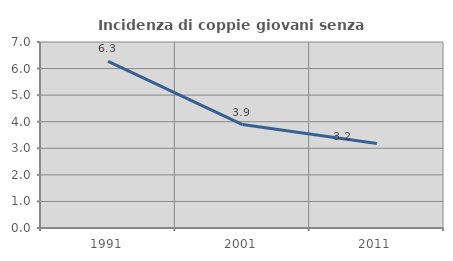
| Category | Incidenza di coppie giovani senza figli |
|---|---|
| 1991.0 | 6.272 |
| 2001.0 | 3.891 |
| 2011.0 | 3.182 |